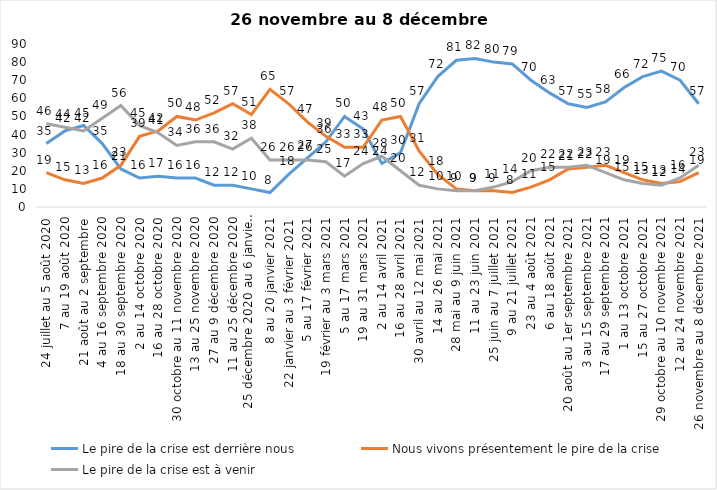
| Category | Le pire de la crise est derrière nous | Nous vivons présentement le pire de la crise | Le pire de la crise est à venir |
|---|---|---|---|
| 24 juillet au 5 août 2020 | 35 | 19 | 46 |
| 7 au 19 août 2020 | 42 | 15 | 44 |
| 21 août au 2 septembre | 45 | 13 | 42 |
| 4 au 16 septembre 2020 | 35 | 16 | 49 |
| 18 au 30 septembre 2020 | 21 | 23 | 56 |
| 2 au 14 octobre 2020 | 16 | 39 | 45 |
| 16 au 28 octobre 2020 | 17 | 42 | 41 |
| 30 octobre au 11 novembre 2020 | 16 | 50 | 34 |
| 13 au 25 novembre 2020 | 16 | 48 | 36 |
| 27 au 9 décembre 2020 | 12 | 52 | 36 |
| 11 au 25 décembre 2020 | 12 | 57 | 32 |
| 25 décembre 2020 au 6 janvier 2021 | 10 | 51 | 38 |
| 8 au 20 janvier 2021 | 8 | 65 | 26 |
| 22 janvier au 3 février 2021 | 18 | 57 | 26 |
| 5 au 17 février 2021 | 27 | 47 | 26 |
| 19 février au 3 mars 2021 | 36 | 39 | 25 |
| 5 au 17 mars 2021 | 50 | 33 | 17 |
| 19 au 31 mars 2021 | 43 | 33 | 24 |
| 2 au 14 avril 2021 | 24 | 48 | 28 |
| 16 au 28 avril 2021 | 30 | 50 | 20 |
| 30 avril au 12 mai 2021 | 57 | 31 | 12 |
| 14 au 26 mai 2021 | 72 | 18 | 10 |
| 28 mai au 9 juin 2021 | 81 | 10 | 9 |
| 11 au 23 juin 2021 | 82 | 9 | 9 |
| 25 juin au 7 juillet 2021 | 80 | 9 | 11 |
| 9 au 21 juillet 2021 | 79 | 8 | 14 |
| 23 au 4 août 2021 | 70 | 11 | 20 |
| 6 au 18 août 2021 | 63 | 15 | 22 |
| 20 août au 1er septembre 2021 | 57 | 21 | 22 |
| 3 au 15 septembre 2021 | 55 | 22 | 23 |
| 17 au 29 septembre 2021 | 58 | 23 | 19 |
| 1 au 13 octobre 2021 | 66 | 19 | 15 |
| 15 au 27 octobre 2021 | 72 | 15 | 13 |
| 29 octobre au 10 novembre 2021 | 75 | 13 | 12 |
| 12 au 24 novembre 2021 | 70 | 14 | 16 |
| 26 novembre au 8 décembre 2021 | 57 | 19 | 23 |